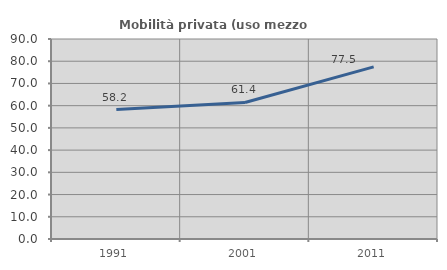
| Category | Mobilità privata (uso mezzo privato) |
|---|---|
| 1991.0 | 58.228 |
| 2001.0 | 61.429 |
| 2011.0 | 77.465 |